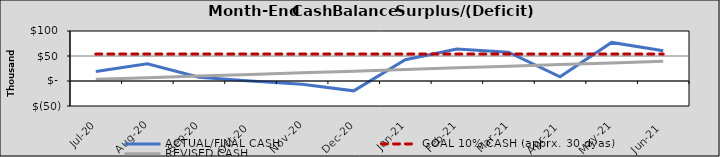
| Category | ACTUAL/FINAL CASH | GOAL 10% CASH (apprx. 30 dyas) | REVISED CASH |
|---|---|---|---|
| 2020-07-01 | 18994.867 | 53875.094 | 3290.909 |
| 2020-08-01 | 34331.735 | 53875.094 | 6581.818 |
| 2020-09-01 | 7374.852 | 53875.094 | 9872.727 |
| 2020-10-02 | 197.569 | 53875.094 | 13163.636 |
| 2020-11-02 | -6715.963 | 53875.094 | 16454.545 |
| 2020-12-03 | -19669.496 | 53875.094 | 19745.454 |
| 2021-01-03 | 42606.971 | 53875.094 | 23036.363 |
| 2021-02-03 | 64031.689 | 53875.094 | 26327.272 |
| 2021-03-06 | 57498.406 | 53875.094 | 29618.181 |
| 2021-04-06 | 8369.873 | 53875.094 | 32909.09 |
| 2021-05-07 | 77106.341 | 53875.094 | 36199.999 |
| 2021-06-07 | 60639.381 | 53875.094 | 39490.908 |